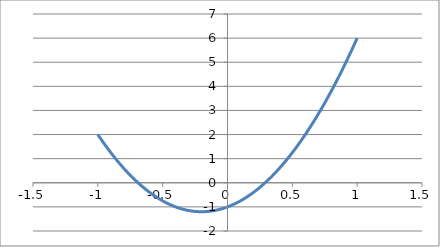
| Category | Series 0 |
|---|---|
| -1.0 | 2 |
| -0.98 | 1.842 |
| -0.96 | 1.688 |
| -0.94 | 1.538 |
| -0.9199999999999999 | 1.392 |
| -0.8999999999999999 | 1.25 |
| -0.8799999999999999 | 1.112 |
| -0.8599999999999999 | 0.978 |
| -0.8399999999999999 | 0.848 |
| -0.8199999999999998 | 0.722 |
| -0.7999999999999998 | 0.6 |
| -0.7799999999999998 | 0.482 |
| -0.7599999999999998 | 0.368 |
| -0.7399999999999998 | 0.258 |
| -0.7199999999999998 | 0.152 |
| -0.6999999999999997 | 0.05 |
| -0.6799999999999997 | -0.048 |
| -0.6599999999999997 | -0.142 |
| -0.6399999999999997 | -0.232 |
| -0.6199999999999997 | -0.318 |
| -0.5999999999999996 | -0.4 |
| -0.5799999999999996 | -0.478 |
| -0.5599999999999996 | -0.552 |
| -0.5399999999999996 | -0.622 |
| -0.5199999999999996 | -0.688 |
| -0.49999999999999956 | -0.75 |
| -0.47999999999999954 | -0.808 |
| -0.4599999999999995 | -0.862 |
| -0.4399999999999995 | -0.912 |
| -0.4199999999999995 | -0.958 |
| -0.39999999999999947 | -1 |
| -0.37999999999999945 | -1.038 |
| -0.35999999999999943 | -1.072 |
| -0.3399999999999994 | -1.102 |
| -0.3199999999999994 | -1.128 |
| -0.2999999999999994 | -1.15 |
| -0.27999999999999936 | -1.168 |
| -0.25999999999999934 | -1.182 |
| -0.23999999999999935 | -1.192 |
| -0.21999999999999936 | -1.198 |
| -0.19999999999999937 | -1.2 |
| -0.17999999999999938 | -1.198 |
| -0.1599999999999994 | -1.192 |
| -0.1399999999999994 | -1.182 |
| -0.1199999999999994 | -1.168 |
| -0.0999999999999994 | -1.15 |
| -0.07999999999999939 | -1.128 |
| -0.05999999999999939 | -1.102 |
| -0.03999999999999938 | -1.072 |
| -0.019999999999999383 | -1.038 |
| 6.175615574477433e-16 | -1 |
| 0.020000000000000618 | -0.958 |
| 0.04000000000000062 | -0.912 |
| 0.06000000000000062 | -0.862 |
| 0.08000000000000063 | -0.808 |
| 0.10000000000000063 | -0.75 |
| 0.12000000000000063 | -0.688 |
| 0.14000000000000062 | -0.622 |
| 0.16000000000000061 | -0.552 |
| 0.1800000000000006 | -0.478 |
| 0.2000000000000006 | -0.4 |
| 0.22000000000000058 | -0.318 |
| 0.24000000000000057 | -0.232 |
| 0.26000000000000056 | -0.142 |
| 0.2800000000000006 | -0.048 |
| 0.3000000000000006 | 0.05 |
| 0.3200000000000006 | 0.152 |
| 0.34000000000000064 | 0.258 |
| 0.36000000000000065 | 0.368 |
| 0.38000000000000067 | 0.482 |
| 0.4000000000000007 | 0.6 |
| 0.4200000000000007 | 0.722 |
| 0.4400000000000007 | 0.848 |
| 0.46000000000000074 | 0.978 |
| 0.48000000000000076 | 1.112 |
| 0.5000000000000008 | 1.25 |
| 0.5200000000000008 | 1.392 |
| 0.5400000000000008 | 1.538 |
| 0.5600000000000008 | 1.688 |
| 0.5800000000000008 | 1.842 |
| 0.6000000000000009 | 2 |
| 0.6200000000000009 | 2.162 |
| 0.6400000000000009 | 2.328 |
| 0.6600000000000009 | 2.498 |
| 0.6800000000000009 | 2.672 |
| 0.700000000000001 | 2.85 |
| 0.720000000000001 | 3.032 |
| 0.740000000000001 | 3.218 |
| 0.760000000000001 | 3.408 |
| 0.780000000000001 | 3.602 |
| 0.800000000000001 | 3.8 |
| 0.8200000000000011 | 4.002 |
| 0.8400000000000011 | 4.208 |
| 0.8600000000000011 | 4.418 |
| 0.8800000000000011 | 4.632 |
| 0.9000000000000011 | 4.85 |
| 0.9200000000000012 | 5.072 |
| 0.9400000000000012 | 5.298 |
| 0.9600000000000012 | 5.528 |
| 0.9800000000000012 | 5.762 |
| 1.000000000000001 | 6 |